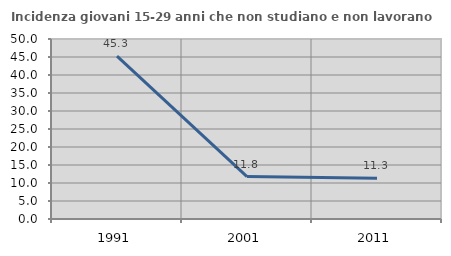
| Category | Incidenza giovani 15-29 anni che non studiano e non lavorano  |
|---|---|
| 1991.0 | 45.27 |
| 2001.0 | 11.798 |
| 2011.0 | 11.307 |